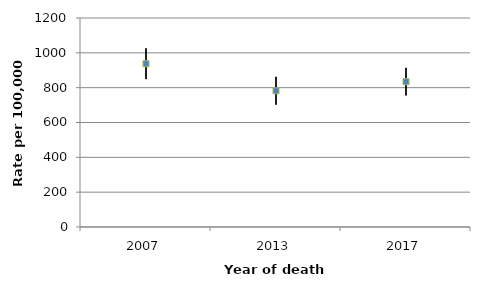
| Category | Upper | Lower | Rate |
|---|---|---|---|
| 2007.0 | 1025.8 | 849.2 | 937.5 |
| 2013.0 | 862.2 | 702.2 | 782.2 |
| 2017.0 | 913.7 | 755.4 | 834.5 |